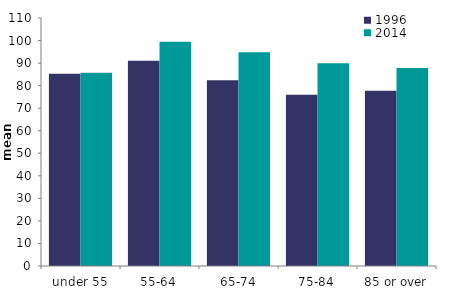
| Category | 1996 | 2014 |
|---|---|---|
| under 55 | 85.309 | 85.679 |
| 55-64 | 91.066 | 99.415 |
| 65-74 | 82.413 | 94.756 |
| 75-84 | 75.94 | 89.974 |
| 85 or over | 77.737 | 87.87 |